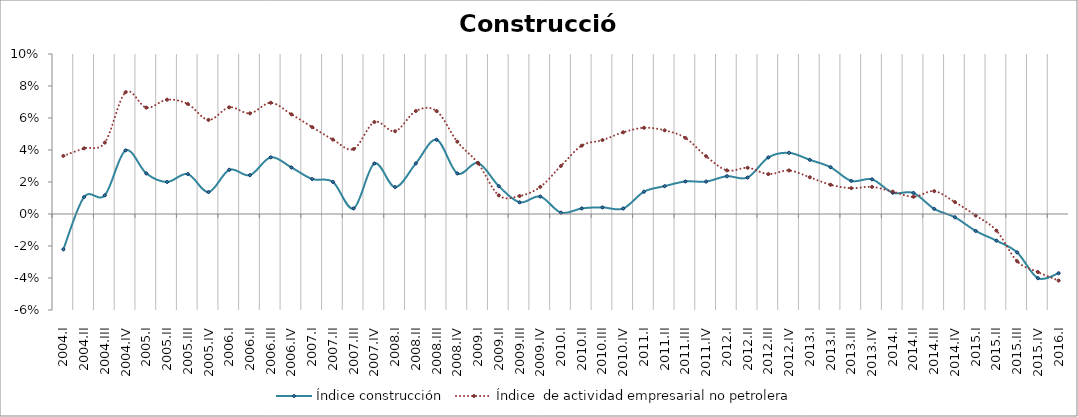
| Category | Índice construcción | Índice  de actividad empresarial no petrolera |
|---|---|---|
| 2004.I | -0.022 | 0.036 |
| 2004.II | 0.011 | 0.041 |
| 2004.III | 0.012 | 0.045 |
| 2004.IV | 0.04 | 0.076 |
| 2005.I | 0.025 | 0.066 |
| 2005.II | 0.02 | 0.071 |
| 2005.III | 0.025 | 0.069 |
| 2005.IV | 0.014 | 0.059 |
| 2006.I | 0.028 | 0.067 |
| 2006.II | 0.024 | 0.063 |
| 2006.III | 0.035 | 0.07 |
| 2006.IV | 0.029 | 0.062 |
| 2007.I | 0.022 | 0.054 |
| 2007.II | 0.02 | 0.047 |
| 2007.III | 0.003 | 0.041 |
| 2007.IV | 0.032 | 0.057 |
| 2008.I | 0.017 | 0.052 |
| 2008.II | 0.032 | 0.064 |
| 2008.III | 0.046 | 0.064 |
| 2008.IV | 0.025 | 0.045 |
| 2009.I | 0.032 | 0.032 |
| 2009.II | 0.017 | 0.012 |
| 2009.III | 0.007 | 0.011 |
| 2009.IV | 0.011 | 0.017 |
| 2010.I | 0.001 | 0.03 |
| 2010.II | 0.003 | 0.043 |
| 2010.III | 0.004 | 0.046 |
| 2010.IV | 0.003 | 0.051 |
| 2011.I | 0.014 | 0.054 |
| 2011.II | 0.017 | 0.052 |
| 2011.III | 0.02 | 0.048 |
| 2011.IV | 0.02 | 0.036 |
| 2012.I | 0.024 | 0.027 |
| 2012.II | 0.023 | 0.029 |
| 2012.III | 0.035 | 0.025 |
| 2012.IV | 0.038 | 0.027 |
| 2013.I | 0.034 | 0.023 |
| 2013.II | 0.029 | 0.018 |
| 2013.III | 0.021 | 0.016 |
| 2013.IV | 0.022 | 0.017 |
| 2014.I | 0.013 | 0.014 |
| 2014.II | 0.013 | 0.011 |
| 2014.III | 0.003 | 0.014 |
| 2014.IV | -0.002 | 0.007 |
| 2015.I | -0.011 | -0.001 |
| 2015.II | -0.017 | -0.01 |
| 2015.III | -0.024 | -0.03 |
| 2015.IV | -0.04 | -0.036 |
| 2016.I | -0.037 | -0.042 |